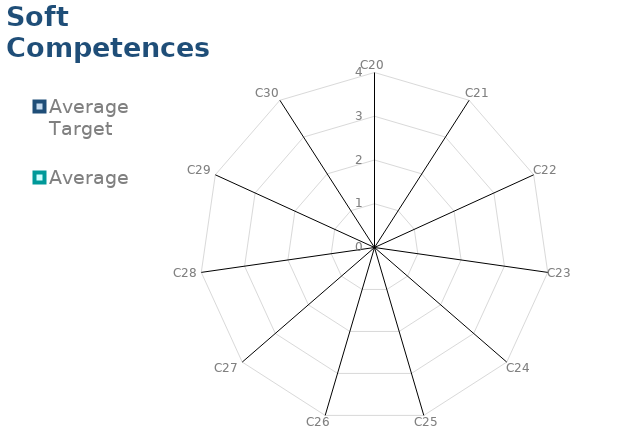
| Category | Average Target | Average |
|---|---|---|
| C20 | 0 | 0 |
| C21 | 0 | 0 |
| C22 | 0 | 0 |
| C23 | 0 | 0 |
| C24 | 0 | 0 |
| C25 | 0 | 0 |
| C26 | 0 | 0 |
| C27 | 0 | 0 |
| C28 | 0 | 0 |
| C29 | 0 | 0 |
| C30 | 0 | 0 |